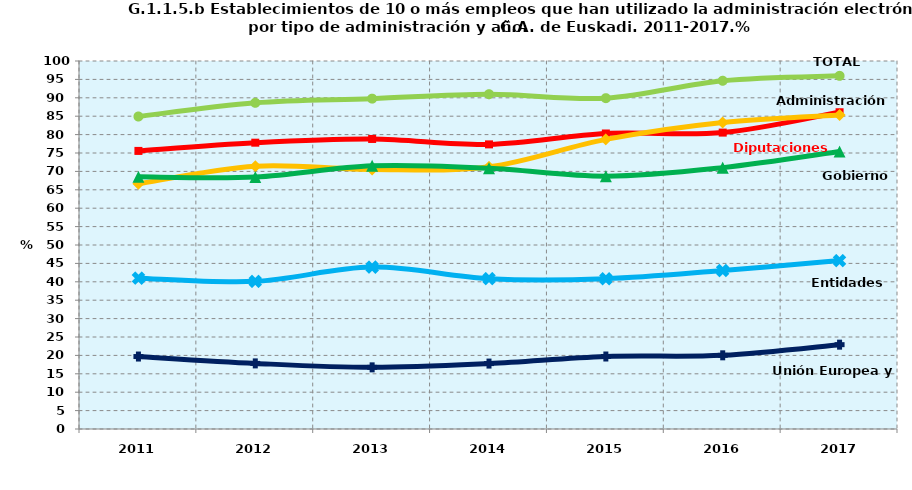
| Category | TOTAL | Diputaciones Forales | Administración Central | Gobierno Vasco | Entidades Locales | Unión Europea y Otros |
|---|---|---|---|---|---|---|
| 2011.0 | 84.919 | 75.566 | 66.635 | 68.518 | 40.99 | 19.69 |
| 2012.0 | 88.639 | 77.803 | 71.399 | 68.457 | 40.12 | 17.825 |
| 2013.0 | 89.774 | 78.814 | 70.5 | 71.513 | 43.99 | 16.752 |
| 2014.0 | 90.972 | 77.343 | 71.245 | 70.852 | 40.845 | 17.779 |
| 2015.0 | 89.9 | 80.3 | 78.7 | 68.7 | 40.845 | 19.7 |
| 2016.0 | 94.63 | 80.543 | 83.285 | 71.025 | 43.062 | 20.023 |
| 2017.0 | 95.964 | 86.074 | 85.341 | 75.396 | 45.758 | 22.918 |